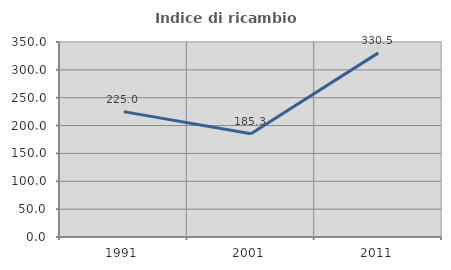
| Category | Indice di ricambio occupazionale  |
|---|---|
| 1991.0 | 225 |
| 2001.0 | 185.263 |
| 2011.0 | 330.508 |